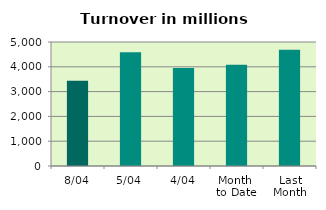
| Category | Series 0 |
|---|---|
| 8/04 | 3437.172 |
| 5/04 | 4585.48 |
| 4/04 | 3950.821 |
| Month 
to Date | 4079.464 |
| Last
Month | 4683.179 |